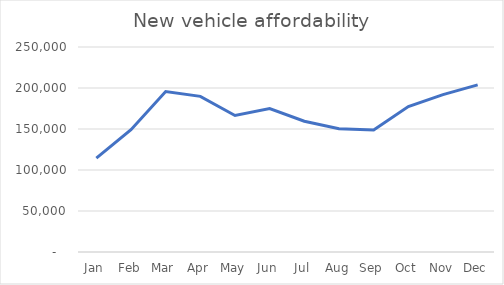
| Category | Series 0 |
|---|---|
| Jan | 114376 |
| Feb | 149144 |
| Mar | 195632 |
| Apr | 189792 |
| May | 166451 |
| Jun | 174865 |
| Jul | 159530 |
| Aug | 150384 |
| Sep | 148841 |
| Oct | 177367 |
| Nov | 191912 |
| Dec | 203778 |